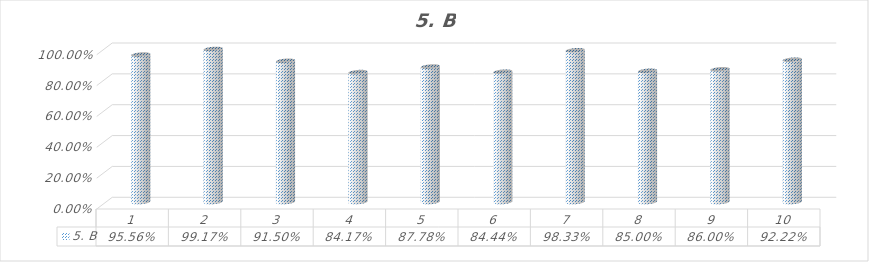
| Category | 5. B |
|---|---|
| 1.0 | 0.956 |
| 2.0 | 0.992 |
| 3.0 | 0.915 |
| 4.0 | 0.842 |
| 5.0 | 0.878 |
| 6.0 | 0.844 |
| 7.0 | 0.983 |
| 8.0 | 0.85 |
| 9.0 | 0.86 |
| 10.0 | 0.922 |